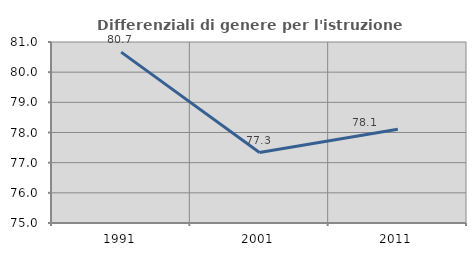
| Category | Differenziali di genere per l'istruzione superiore |
|---|---|
| 1991.0 | 80.663 |
| 2001.0 | 77.336 |
| 2011.0 | 78.109 |